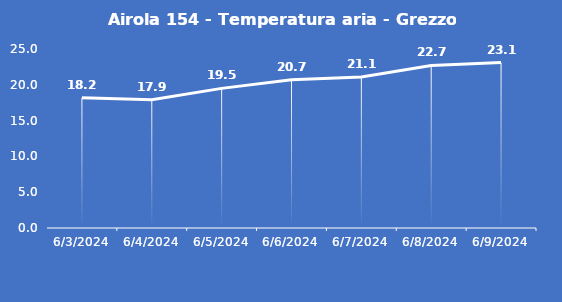
| Category | Airola 154 - Temperatura aria - Grezzo (°C) |
|---|---|
| 6/3/24 | 18.2 |
| 6/4/24 | 17.9 |
| 6/5/24 | 19.5 |
| 6/6/24 | 20.7 |
| 6/7/24 | 21.1 |
| 6/8/24 | 22.7 |
| 6/9/24 | 23.1 |